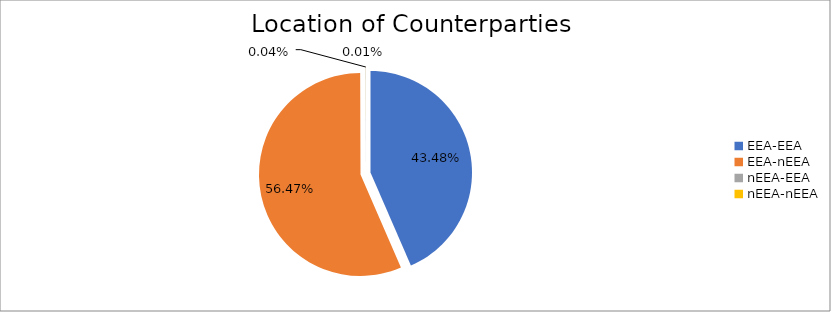
| Category | Series 0 |
|---|---|
| EEA-EEA | 4852833.841 |
| EEA-nEEA | 6302443.805 |
| nEEA-EEA | 4496.711 |
| nEEA-nEEA | 1047.136 |